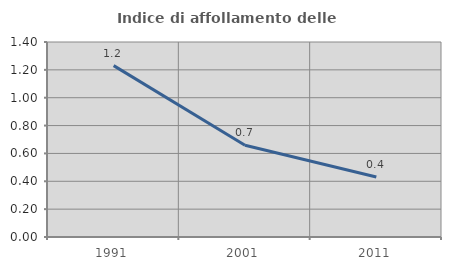
| Category | Indice di affollamento delle abitazioni  |
|---|---|
| 1991.0 | 1.23 |
| 2001.0 | 0.659 |
| 2011.0 | 0.431 |